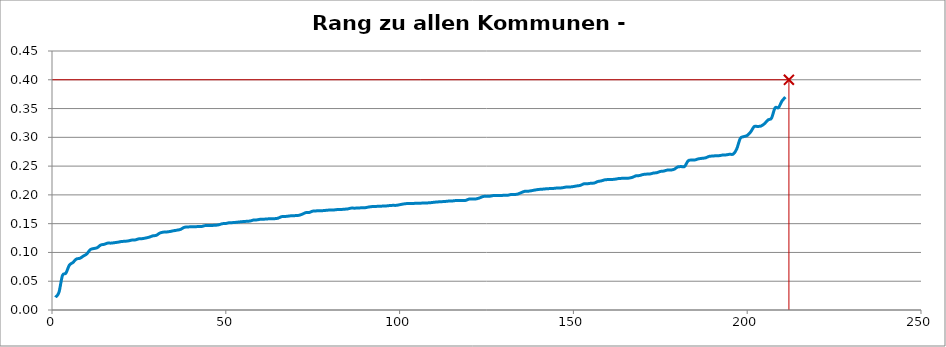
| Category | Kommunenrangfolge |
|---|---|
| 0 | 0.022 |
| 1 | 0.031 |
| 2 | 0.06 |
| 3 | 0.064 |
| 4 | 0.078 |
| 5 | 0.082 |
| 6 | 0.089 |
| 7 | 0.09 |
| 8 | 0.094 |
| 9 | 0.097 |
| 10 | 0.105 |
| 11 | 0.107 |
| 12 | 0.108 |
| 13 | 0.113 |
| 14 | 0.114 |
| 15 | 0.116 |
| 16 | 0.116 |
| 17 | 0.117 |
| 18 | 0.118 |
| 19 | 0.119 |
| 20 | 0.119 |
| 21 | 0.12 |
| 22 | 0.122 |
| 23 | 0.122 |
| 24 | 0.124 |
| 25 | 0.124 |
| 26 | 0.125 |
| 27 | 0.127 |
| 28 | 0.129 |
| 29 | 0.13 |
| 30 | 0.134 |
| 31 | 0.135 |
| 32 | 0.136 |
| 33 | 0.136 |
| 34 | 0.138 |
| 35 | 0.139 |
| 36 | 0.14 |
| 37 | 0.144 |
| 38 | 0.144 |
| 39 | 0.144 |
| 40 | 0.145 |
| 41 | 0.145 |
| 42 | 0.145 |
| 43 | 0.147 |
| 44 | 0.147 |
| 45 | 0.147 |
| 46 | 0.147 |
| 47 | 0.148 |
| 48 | 0.15 |
| 49 | 0.15 |
| 50 | 0.152 |
| 51 | 0.152 |
| 52 | 0.152 |
| 53 | 0.153 |
| 54 | 0.154 |
| 55 | 0.154 |
| 56 | 0.155 |
| 57 | 0.156 |
| 58 | 0.157 |
| 59 | 0.158 |
| 60 | 0.158 |
| 61 | 0.158 |
| 62 | 0.158 |
| 63 | 0.159 |
| 64 | 0.159 |
| 65 | 0.162 |
| 66 | 0.162 |
| 67 | 0.163 |
| 68 | 0.164 |
| 69 | 0.164 |
| 70 | 0.164 |
| 71 | 0.166 |
| 72 | 0.169 |
| 73 | 0.169 |
| 74 | 0.172 |
| 75 | 0.172 |
| 76 | 0.172 |
| 77 | 0.173 |
| 78 | 0.173 |
| 79 | 0.174 |
| 80 | 0.174 |
| 81 | 0.174 |
| 82 | 0.174 |
| 83 | 0.175 |
| 84 | 0.176 |
| 85 | 0.177 |
| 86 | 0.177 |
| 87 | 0.177 |
| 88 | 0.178 |
| 89 | 0.178 |
| 90 | 0.179 |
| 91 | 0.18 |
| 92 | 0.18 |
| 93 | 0.18 |
| 94 | 0.18 |
| 95 | 0.181 |
| 96 | 0.181 |
| 97 | 0.182 |
| 98 | 0.182 |
| 99 | 0.183 |
| 100 | 0.184 |
| 101 | 0.185 |
| 102 | 0.185 |
| 103 | 0.185 |
| 104 | 0.186 |
| 105 | 0.186 |
| 106 | 0.186 |
| 107 | 0.186 |
| 108 | 0.187 |
| 109 | 0.187 |
| 110 | 0.188 |
| 111 | 0.188 |
| 112 | 0.188 |
| 113 | 0.189 |
| 114 | 0.189 |
| 115 | 0.19 |
| 116 | 0.19 |
| 117 | 0.19 |
| 118 | 0.19 |
| 119 | 0.193 |
| 120 | 0.193 |
| 121 | 0.193 |
| 122 | 0.195 |
| 123 | 0.197 |
| 124 | 0.198 |
| 125 | 0.198 |
| 126 | 0.199 |
| 127 | 0.199 |
| 128 | 0.199 |
| 129 | 0.199 |
| 130 | 0.199 |
| 131 | 0.201 |
| 132 | 0.201 |
| 133 | 0.201 |
| 134 | 0.204 |
| 135 | 0.206 |
| 136 | 0.206 |
| 137 | 0.207 |
| 138 | 0.209 |
| 139 | 0.209 |
| 140 | 0.21 |
| 141 | 0.21 |
| 142 | 0.211 |
| 143 | 0.211 |
| 144 | 0.212 |
| 145 | 0.212 |
| 146 | 0.213 |
| 147 | 0.214 |
| 148 | 0.214 |
| 149 | 0.215 |
| 150 | 0.216 |
| 151 | 0.217 |
| 152 | 0.219 |
| 153 | 0.219 |
| 154 | 0.22 |
| 155 | 0.221 |
| 156 | 0.223 |
| 157 | 0.224 |
| 158 | 0.226 |
| 159 | 0.227 |
| 160 | 0.227 |
| 161 | 0.227 |
| 162 | 0.228 |
| 163 | 0.229 |
| 164 | 0.229 |
| 165 | 0.229 |
| 166 | 0.231 |
| 167 | 0.233 |
| 168 | 0.234 |
| 169 | 0.235 |
| 170 | 0.236 |
| 171 | 0.236 |
| 172 | 0.238 |
| 173 | 0.239 |
| 174 | 0.241 |
| 175 | 0.241 |
| 176 | 0.243 |
| 177 | 0.243 |
| 178 | 0.245 |
| 179 | 0.249 |
| 180 | 0.249 |
| 181 | 0.249 |
| 182 | 0.259 |
| 183 | 0.261 |
| 184 | 0.261 |
| 185 | 0.263 |
| 186 | 0.264 |
| 187 | 0.264 |
| 188 | 0.267 |
| 189 | 0.267 |
| 190 | 0.268 |
| 191 | 0.268 |
| 192 | 0.269 |
| 193 | 0.27 |
| 194 | 0.271 |
| 195 | 0.271 |
| 196 | 0.28 |
| 197 | 0.298 |
| 198 | 0.301 |
| 199 | 0.303 |
| 200 | 0.309 |
| 201 | 0.319 |
| 202 | 0.319 |
| 203 | 0.32 |
| 204 | 0.324 |
| 205 | 0.33 |
| 206 | 0.333 |
| 207 | 0.351 |
| 208 | 0.352 |
| 209 | 0.363 |
| 210 | 0.37 |